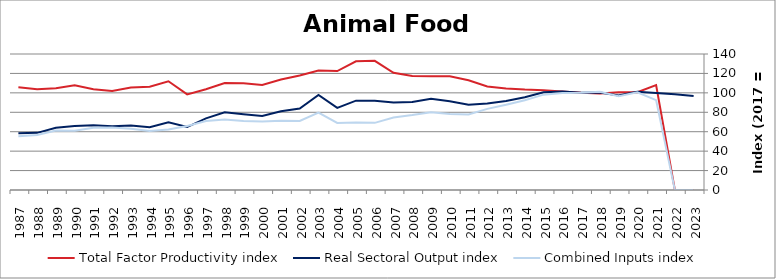
| Category | Total Factor Productivity index | Real Sectoral Output index | Combined Inputs index |
|---|---|---|---|
| 2023.0 | 0 | 96.806 | 0 |
| 2022.0 | 0 | 98.551 | 0 |
| 2021.0 | 108.061 | 99.957 | 92.501 |
| 2020.0 | 100.645 | 101.257 | 100.608 |
| 2019.0 | 100.708 | 97.208 | 96.525 |
| 2018.0 | 99.362 | 100.419 | 101.064 |
| 2017.0 | 100 | 100 | 100 |
| 2016.0 | 101.452 | 101.426 | 99.975 |
| 2015.0 | 102.587 | 100.705 | 98.166 |
| 2014.0 | 103.337 | 95.522 | 92.438 |
| 2013.0 | 104.55 | 91.664 | 87.674 |
| 2012.0 | 106.645 | 89.062 | 83.513 |
| 2011.0 | 112.961 | 87.724 | 77.659 |
| 2010.0 | 117.012 | 91.465 | 78.167 |
| 2009.0 | 117.129 | 93.831 | 80.109 |
| 2008.0 | 117.315 | 90.541 | 77.177 |
| 2007.0 | 120.625 | 90.088 | 74.684 |
| 2006.0 | 132.942 | 91.914 | 69.138 |
| 2005.0 | 132.481 | 91.955 | 69.41 |
| 2004.0 | 122.382 | 84.522 | 69.064 |
| 2003.0 | 122.991 | 97.875 | 79.58 |
| 2002.0 | 117.87 | 83.827 | 71.118 |
| 2001.0 | 113.752 | 80.957 | 71.17 |
| 2000.0 | 108.019 | 76.114 | 70.463 |
| 1999.0 | 109.958 | 78.044 | 70.976 |
| 1998.0 | 110.106 | 80.01 | 72.667 |
| 1997.0 | 103.711 | 73.695 | 71.058 |
| 1996.0 | 98.448 | 64.815 | 65.836 |
| 1995.0 | 111.963 | 69.802 | 62.343 |
| 1994.0 | 106.404 | 64.655 | 60.764 |
| 1993.0 | 105.443 | 66.453 | 63.023 |
| 1992.0 | 101.94 | 65.537 | 64.29 |
| 1991.0 | 103.723 | 66.532 | 64.144 |
| 1990.0 | 107.7 | 65.815 | 61.11 |
| 1989.0 | 104.639 | 64.021 | 61.183 |
| 1988.0 | 103.833 | 58.814 | 56.643 |
| 1987.0 | 105.76 | 58.532 | 55.345 |